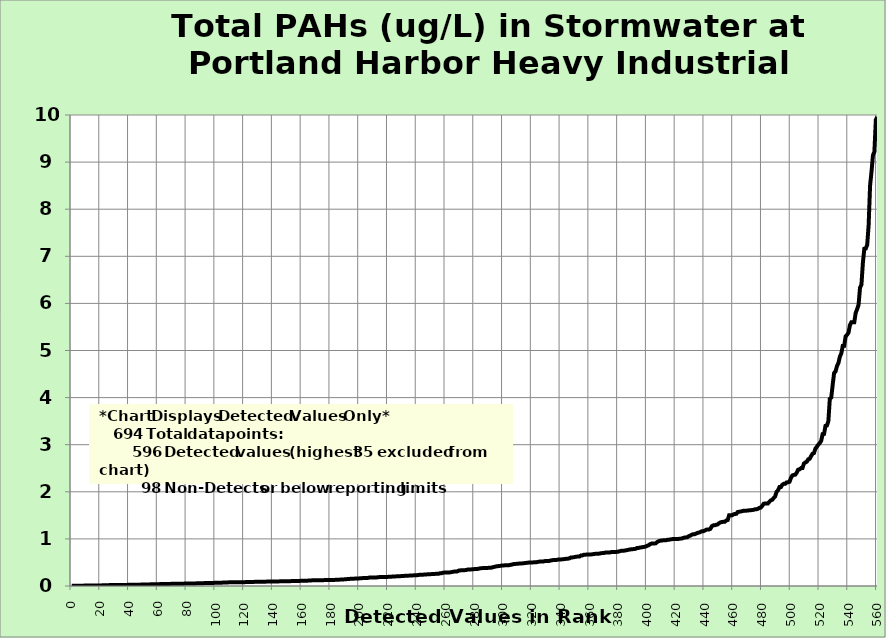
| Category | PAHs |
|---|---|
| 0.0 | 0.005 |
| 1.0 | 0.005 |
| 2.0 | 0.006 |
| 3.0 | 0.006 |
| 4.0 | 0.007 |
| 5.0 | 0.007 |
| 6.0 | 0.008 |
| 7.0 | 0.008 |
| 8.0 | 0.008 |
| 9.0 | 0.008 |
| 10.0 | 0.008 |
| 11.0 | 0.008 |
| 12.0 | 0.009 |
| 13.0 | 0.009 |
| 14.0 | 0.01 |
| 15.0 | 0.011 |
| 16.0 | 0.012 |
| 17.0 | 0.012 |
| 18.0 | 0.012 |
| 19.0 | 0.012 |
| 20.0 | 0.013 |
| 21.0 | 0.013 |
| 22.0 | 0.015 |
| 23.0 | 0.015 |
| 24.0 | 0.016 |
| 25.0 | 0.017 |
| 26.0 | 0.019 |
| 27.0 | 0.02 |
| 28.0 | 0.02 |
| 29.0 | 0.021 |
| 30.0 | 0.021 |
| 31.0 | 0.021 |
| 32.0 | 0.021 |
| 33.0 | 0.021 |
| 34.0 | 0.021 |
| 35.0 | 0.022 |
| 36.0 | 0.022 |
| 37.0 | 0.023 |
| 38.0 | 0.024 |
| 39.0 | 0.024 |
| 40.0 | 0.024 |
| 41.0 | 0.025 |
| 42.0 | 0.026 |
| 43.0 | 0.027 |
| 44.0 | 0.027 |
| 45.0 | 0.027 |
| 46.0 | 0.028 |
| 47.0 | 0.028 |
| 48.0 | 0.029 |
| 49.0 | 0.03 |
| 50.0 | 0.032 |
| 51.0 | 0.033 |
| 52.0 | 0.033 |
| 53.0 | 0.034 |
| 54.0 | 0.034 |
| 55.0 | 0.035 |
| 56.0 | 0.036 |
| 57.0 | 0.038 |
| 58.0 | 0.038 |
| 59.0 | 0.038 |
| 60.0 | 0.04 |
| 61.0 | 0.04 |
| 62.0 | 0.041 |
| 63.0 | 0.042 |
| 64.0 | 0.042 |
| 65.0 | 0.043 |
| 66.0 | 0.043 |
| 67.0 | 0.044 |
| 68.0 | 0.045 |
| 69.0 | 0.045 |
| 70.0 | 0.045 |
| 71.0 | 0.047 |
| 72.0 | 0.047 |
| 73.0 | 0.048 |
| 74.0 | 0.048 |
| 75.0 | 0.049 |
| 76.0 | 0.05 |
| 77.0 | 0.05 |
| 78.0 | 0.05 |
| 79.0 | 0.051 |
| 80.0 | 0.051 |
| 81.0 | 0.051 |
| 82.0 | 0.052 |
| 83.0 | 0.053 |
| 84.0 | 0.053 |
| 85.0 | 0.054 |
| 86.0 | 0.055 |
| 87.0 | 0.056 |
| 88.0 | 0.057 |
| 89.0 | 0.058 |
| 90.0 | 0.06 |
| 91.0 | 0.061 |
| 92.0 | 0.061 |
| 93.0 | 0.061 |
| 94.0 | 0.061 |
| 95.0 | 0.062 |
| 96.0 | 0.062 |
| 97.0 | 0.063 |
| 98.0 | 0.064 |
| 99.0 | 0.067 |
| 100.0 | 0.067 |
| 101.0 | 0.068 |
| 102.0 | 0.069 |
| 103.0 | 0.069 |
| 104.0 | 0.07 |
| 105.0 | 0.072 |
| 106.0 | 0.072 |
| 107.0 | 0.073 |
| 108.0 | 0.074 |
| 109.0 | 0.077 |
| 110.0 | 0.077 |
| 111.0 | 0.078 |
| 112.0 | 0.078 |
| 113.0 | 0.078 |
| 114.0 | 0.078 |
| 115.0 | 0.079 |
| 116.0 | 0.079 |
| 117.0 | 0.08 |
| 118.0 | 0.081 |
| 119.0 | 0.081 |
| 120.0 | 0.082 |
| 121.0 | 0.083 |
| 122.0 | 0.083 |
| 123.0 | 0.085 |
| 124.0 | 0.085 |
| 125.0 | 0.085 |
| 126.0 | 0.086 |
| 127.0 | 0.088 |
| 128.0 | 0.088 |
| 129.0 | 0.089 |
| 130.0 | 0.089 |
| 131.0 | 0.09 |
| 132.0 | 0.091 |
| 133.0 | 0.091 |
| 134.0 | 0.092 |
| 135.0 | 0.093 |
| 136.0 | 0.094 |
| 137.0 | 0.095 |
| 138.0 | 0.095 |
| 139.0 | 0.096 |
| 140.0 | 0.097 |
| 141.0 | 0.097 |
| 142.0 | 0.098 |
| 143.0 | 0.098 |
| 144.0 | 0.098 |
| 145.0 | 0.099 |
| 146.0 | 0.1 |
| 147.0 | 0.1 |
| 148.0 | 0.1 |
| 149.0 | 0.101 |
| 150.0 | 0.102 |
| 151.0 | 0.102 |
| 152.0 | 0.103 |
| 153.0 | 0.104 |
| 154.0 | 0.105 |
| 155.0 | 0.105 |
| 156.0 | 0.105 |
| 157.0 | 0.106 |
| 158.0 | 0.107 |
| 159.0 | 0.11 |
| 160.0 | 0.11 |
| 161.0 | 0.11 |
| 162.0 | 0.111 |
| 163.0 | 0.112 |
| 164.0 | 0.113 |
| 165.0 | 0.117 |
| 166.0 | 0.118 |
| 167.0 | 0.12 |
| 168.0 | 0.12 |
| 169.0 | 0.12 |
| 170.0 | 0.12 |
| 171.0 | 0.121 |
| 172.0 | 0.122 |
| 173.0 | 0.122 |
| 174.0 | 0.123 |
| 175.0 | 0.124 |
| 176.0 | 0.126 |
| 177.0 | 0.126 |
| 178.0 | 0.127 |
| 179.0 | 0.127 |
| 180.0 | 0.129 |
| 181.0 | 0.129 |
| 182.0 | 0.129 |
| 183.0 | 0.13 |
| 184.0 | 0.132 |
| 185.0 | 0.134 |
| 186.0 | 0.134 |
| 187.0 | 0.138 |
| 188.0 | 0.14 |
| 189.0 | 0.14 |
| 190.0 | 0.142 |
| 191.0 | 0.145 |
| 192.0 | 0.148 |
| 193.0 | 0.15 |
| 194.0 | 0.153 |
| 195.0 | 0.153 |
| 196.0 | 0.156 |
| 197.0 | 0.157 |
| 198.0 | 0.161 |
| 199.0 | 0.162 |
| 200.0 | 0.162 |
| 201.0 | 0.165 |
| 202.0 | 0.167 |
| 203.0 | 0.169 |
| 204.0 | 0.17 |
| 205.0 | 0.17 |
| 206.0 | 0.172 |
| 207.0 | 0.18 |
| 208.0 | 0.18 |
| 209.0 | 0.18 |
| 210.0 | 0.18 |
| 211.0 | 0.181 |
| 212.0 | 0.183 |
| 213.0 | 0.185 |
| 214.0 | 0.19 |
| 215.0 | 0.19 |
| 216.0 | 0.19 |
| 217.0 | 0.19 |
| 218.0 | 0.191 |
| 219.0 | 0.192 |
| 220.0 | 0.194 |
| 221.0 | 0.195 |
| 222.0 | 0.196 |
| 223.0 | 0.201 |
| 224.0 | 0.201 |
| 225.0 | 0.204 |
| 226.0 | 0.205 |
| 227.0 | 0.208 |
| 228.0 | 0.209 |
| 229.0 | 0.21 |
| 230.0 | 0.212 |
| 231.0 | 0.214 |
| 232.0 | 0.218 |
| 233.0 | 0.22 |
| 234.0 | 0.22 |
| 235.0 | 0.221 |
| 236.0 | 0.221 |
| 237.0 | 0.224 |
| 238.0 | 0.227 |
| 239.0 | 0.228 |
| 240.0 | 0.228 |
| 241.0 | 0.235 |
| 242.0 | 0.237 |
| 243.0 | 0.238 |
| 244.0 | 0.239 |
| 245.0 | 0.243 |
| 246.0 | 0.244 |
| 247.0 | 0.247 |
| 248.0 | 0.249 |
| 249.0 | 0.251 |
| 250.0 | 0.252 |
| 251.0 | 0.253 |
| 252.0 | 0.256 |
| 253.0 | 0.258 |
| 254.0 | 0.26 |
| 255.0 | 0.26 |
| 256.0 | 0.27 |
| 257.0 | 0.27 |
| 258.0 | 0.283 |
| 259.0 | 0.284 |
| 260.0 | 0.285 |
| 261.0 | 0.285 |
| 262.0 | 0.286 |
| 263.0 | 0.29 |
| 264.0 | 0.295 |
| 265.0 | 0.302 |
| 266.0 | 0.307 |
| 267.0 | 0.31 |
| 268.0 | 0.31 |
| 269.0 | 0.327 |
| 270.0 | 0.33 |
| 271.0 | 0.336 |
| 272.0 | 0.336 |
| 273.0 | 0.336 |
| 274.0 | 0.338 |
| 275.0 | 0.347 |
| 276.0 | 0.35 |
| 277.0 | 0.352 |
| 278.0 | 0.353 |
| 279.0 | 0.355 |
| 280.0 | 0.359 |
| 281.0 | 0.36 |
| 282.0 | 0.362 |
| 283.0 | 0.368 |
| 284.0 | 0.377 |
| 285.0 | 0.379 |
| 286.0 | 0.38 |
| 287.0 | 0.38 |
| 288.0 | 0.381 |
| 289.0 | 0.384 |
| 290.0 | 0.387 |
| 291.0 | 0.387 |
| 292.0 | 0.392 |
| 293.0 | 0.4 |
| 294.0 | 0.408 |
| 295.0 | 0.416 |
| 296.0 | 0.42 |
| 297.0 | 0.425 |
| 298.0 | 0.428 |
| 299.0 | 0.434 |
| 300.0 | 0.435 |
| 301.0 | 0.439 |
| 302.0 | 0.44 |
| 303.0 | 0.44 |
| 304.0 | 0.442 |
| 305.0 | 0.45 |
| 306.0 | 0.454 |
| 307.0 | 0.464 |
| 308.0 | 0.468 |
| 309.0 | 0.47 |
| 310.0 | 0.472 |
| 311.0 | 0.476 |
| 312.0 | 0.48 |
| 313.0 | 0.48 |
| 314.0 | 0.482 |
| 315.0 | 0.488 |
| 316.0 | 0.491 |
| 317.0 | 0.495 |
| 318.0 | 0.498 |
| 319.0 | 0.498 |
| 320.0 | 0.5 |
| 321.0 | 0.502 |
| 322.0 | 0.504 |
| 323.0 | 0.505 |
| 324.0 | 0.512 |
| 325.0 | 0.517 |
| 326.0 | 0.52 |
| 327.0 | 0.52 |
| 328.0 | 0.521 |
| 329.0 | 0.53 |
| 330.0 | 0.53 |
| 331.0 | 0.532 |
| 332.0 | 0.533 |
| 333.0 | 0.541 |
| 334.0 | 0.548 |
| 335.0 | 0.551 |
| 336.0 | 0.552 |
| 337.0 | 0.554 |
| 338.0 | 0.56 |
| 339.0 | 0.56 |
| 340.0 | 0.562 |
| 341.0 | 0.568 |
| 342.0 | 0.57 |
| 343.0 | 0.574 |
| 344.0 | 0.58 |
| 345.0 | 0.58 |
| 346.0 | 0.587 |
| 347.0 | 0.606 |
| 348.0 | 0.607 |
| 349.0 | 0.61 |
| 350.0 | 0.618 |
| 351.0 | 0.623 |
| 352.0 | 0.626 |
| 353.0 | 0.626 |
| 354.0 | 0.65 |
| 355.0 | 0.65 |
| 356.0 | 0.663 |
| 357.0 | 0.665 |
| 358.0 | 0.667 |
| 359.0 | 0.668 |
| 360.0 | 0.669 |
| 361.0 | 0.671 |
| 362.0 | 0.672 |
| 363.0 | 0.68 |
| 364.0 | 0.683 |
| 365.0 | 0.683 |
| 366.0 | 0.684 |
| 367.0 | 0.69 |
| 368.0 | 0.696 |
| 369.0 | 0.699 |
| 370.0 | 0.7 |
| 371.0 | 0.71 |
| 372.0 | 0.71 |
| 373.0 | 0.71 |
| 374.0 | 0.71 |
| 375.0 | 0.72 |
| 376.0 | 0.72 |
| 377.0 | 0.72 |
| 378.0 | 0.72 |
| 379.0 | 0.727 |
| 380.0 | 0.729 |
| 381.0 | 0.74 |
| 382.0 | 0.747 |
| 383.0 | 0.748 |
| 384.0 | 0.75 |
| 385.0 | 0.756 |
| 386.0 | 0.761 |
| 387.0 | 0.77 |
| 388.0 | 0.774 |
| 389.0 | 0.78 |
| 390.0 | 0.782 |
| 391.0 | 0.785 |
| 392.0 | 0.79 |
| 393.0 | 0.808 |
| 394.0 | 0.808 |
| 395.0 | 0.816 |
| 396.0 | 0.82 |
| 397.0 | 0.826 |
| 398.0 | 0.83 |
| 399.0 | 0.838 |
| 400.0 | 0.854 |
| 401.0 | 0.863 |
| 402.0 | 0.888 |
| 403.0 | 0.9 |
| 404.0 | 0.901 |
| 405.0 | 0.902 |
| 406.0 | 0.907 |
| 407.0 | 0.934 |
| 408.0 | 0.95 |
| 409.0 | 0.96 |
| 410.0 | 0.965 |
| 411.0 | 0.969 |
| 412.0 | 0.97 |
| 413.0 | 0.97 |
| 414.0 | 0.98 |
| 415.0 | 0.98 |
| 416.0 | 0.988 |
| 417.0 | 0.993 |
| 418.0 | 0.998 |
| 419.0 | 1 |
| 420.0 | 1 |
| 421.0 | 1 |
| 422.0 | 1 |
| 423.0 | 1.006 |
| 424.0 | 1.006 |
| 425.0 | 1.02 |
| 426.0 | 1.028 |
| 427.0 | 1.032 |
| 428.0 | 1.036 |
| 429.0 | 1.06 |
| 430.0 | 1.068 |
| 431.0 | 1.089 |
| 432.0 | 1.1 |
| 433.0 | 1.1 |
| 434.0 | 1.113 |
| 435.0 | 1.127 |
| 436.0 | 1.134 |
| 437.0 | 1.147 |
| 438.0 | 1.161 |
| 439.0 | 1.164 |
| 440.0 | 1.175 |
| 441.0 | 1.194 |
| 442.0 | 1.2 |
| 443.0 | 1.2 |
| 444.0 | 1.215 |
| 445.0 | 1.27 |
| 446.0 | 1.287 |
| 447.0 | 1.289 |
| 448.0 | 1.3 |
| 449.0 | 1.306 |
| 450.0 | 1.334 |
| 451.0 | 1.35 |
| 452.0 | 1.36 |
| 453.0 | 1.362 |
| 454.0 | 1.364 |
| 455.0 | 1.391 |
| 456.0 | 1.4 |
| 457.0 | 1.5 |
| 458.0 | 1.5 |
| 459.0 | 1.5 |
| 460.0 | 1.522 |
| 461.0 | 1.529 |
| 462.0 | 1.532 |
| 463.0 | 1.572 |
| 464.0 | 1.576 |
| 465.0 | 1.582 |
| 466.0 | 1.588 |
| 467.0 | 1.598 |
| 468.0 | 1.6 |
| 469.0 | 1.6 |
| 470.0 | 1.601 |
| 471.0 | 1.607 |
| 472.0 | 1.608 |
| 473.0 | 1.614 |
| 474.0 | 1.617 |
| 475.0 | 1.628 |
| 476.0 | 1.629 |
| 477.0 | 1.639 |
| 478.0 | 1.659 |
| 479.0 | 1.664 |
| 480.0 | 1.7 |
| 481.0 | 1.746 |
| 482.0 | 1.752 |
| 483.0 | 1.752 |
| 484.0 | 1.753 |
| 485.0 | 1.79 |
| 486.0 | 1.82 |
| 487.0 | 1.83 |
| 488.0 | 1.869 |
| 489.0 | 1.9 |
| 490.0 | 2 |
| 491.0 | 2.031 |
| 492.0 | 2.1 |
| 493.0 | 2.1 |
| 494.0 | 2.15 |
| 495.0 | 2.17 |
| 496.0 | 2.17 |
| 497.0 | 2.2 |
| 498.0 | 2.202 |
| 499.0 | 2.213 |
| 500.0 | 2.296 |
| 501.0 | 2.347 |
| 502.0 | 2.359 |
| 503.0 | 2.364 |
| 504.0 | 2.405 |
| 505.0 | 2.469 |
| 506.0 | 2.477 |
| 507.0 | 2.503 |
| 508.0 | 2.504 |
| 509.0 | 2.6 |
| 510.0 | 2.623 |
| 511.0 | 2.638 |
| 512.0 | 2.69 |
| 513.0 | 2.7 |
| 514.0 | 2.757 |
| 515.0 | 2.809 |
| 516.0 | 2.824 |
| 517.0 | 2.917 |
| 518.0 | 2.958 |
| 519.0 | 3 |
| 520.0 | 3.035 |
| 521.0 | 3.08 |
| 522.0 | 3.225 |
| 523.0 | 3.229 |
| 524.0 | 3.4 |
| 525.0 | 3.408 |
| 526.0 | 3.499 |
| 527.0 | 3.973 |
| 528.0 | 4 |
| 529.0 | 4.272 |
| 530.0 | 4.523 |
| 531.0 | 4.556 |
| 532.0 | 4.671 |
| 533.0 | 4.735 |
| 534.0 | 4.87 |
| 535.0 | 4.94 |
| 536.0 | 5.098 |
| 537.0 | 5.1 |
| 538.0 | 5.3 |
| 539.0 | 5.333 |
| 540.0 | 5.379 |
| 541.0 | 5.54 |
| 542.0 | 5.6 |
| 543.0 | 5.6 |
| 544.0 | 5.6 |
| 545.0 | 5.802 |
| 546.0 | 5.879 |
| 547.0 | 5.972 |
| 548.0 | 6.333 |
| 549.0 | 6.4 |
| 550.0 | 6.867 |
| 551.0 | 7.16 |
| 552.0 | 7.165 |
| 553.0 | 7.244 |
| 554.0 | 7.666 |
| 555.0 | 8.504 |
| 556.0 | 8.8 |
| 557.0 | 9.147 |
| 558.0 | 9.22 |
| 559.0 | 9.9 |
| 560.0 | 9.959 |